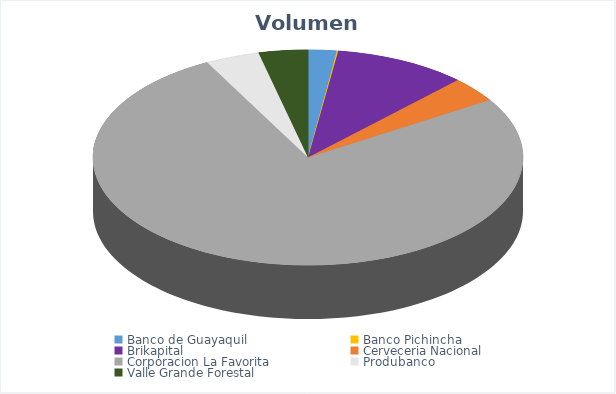
| Category | VOLUMEN ($USD) |
|---|---|
| Banco de Guayaquil | 10709.16 |
| Banco Pichincha | 540 |
| Brikapital | 50000 |
| Cerveceria Nacional | 18952 |
| Corporacion La Favorita | 381948.45 |
| Produbanco | 20400 |
| Valle Grande Forestal | 18506.8 |